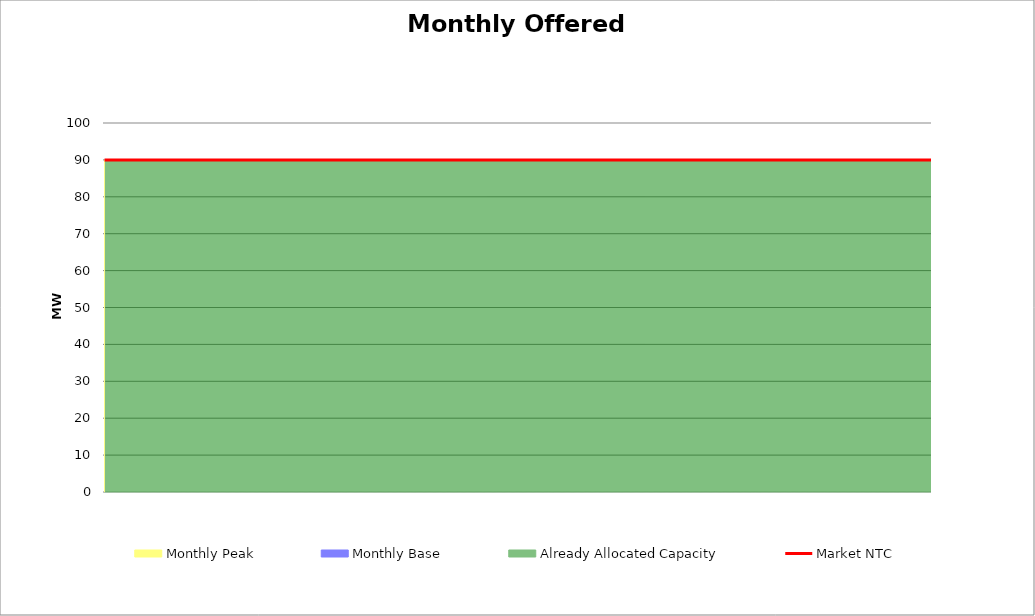
| Category | Market NTC |
|---|---|
| 0 | 90 |
| 1 | 90 |
| 2 | 90 |
| 3 | 90 |
| 4 | 90 |
| 5 | 90 |
| 6 | 90 |
| 7 | 90 |
| 8 | 90 |
| 9 | 90 |
| 10 | 90 |
| 11 | 90 |
| 12 | 90 |
| 13 | 90 |
| 14 | 90 |
| 15 | 90 |
| 16 | 90 |
| 17 | 90 |
| 18 | 90 |
| 19 | 90 |
| 20 | 90 |
| 21 | 90 |
| 22 | 90 |
| 23 | 90 |
| 24 | 90 |
| 25 | 90 |
| 26 | 90 |
| 27 | 90 |
| 28 | 90 |
| 29 | 90 |
| 30 | 90 |
| 31 | 90 |
| 32 | 90 |
| 33 | 90 |
| 34 | 90 |
| 35 | 90 |
| 36 | 90 |
| 37 | 90 |
| 38 | 90 |
| 39 | 90 |
| 40 | 90 |
| 41 | 90 |
| 42 | 90 |
| 43 | 90 |
| 44 | 90 |
| 45 | 90 |
| 46 | 90 |
| 47 | 90 |
| 48 | 90 |
| 49 | 90 |
| 50 | 90 |
| 51 | 90 |
| 52 | 90 |
| 53 | 90 |
| 54 | 90 |
| 55 | 90 |
| 56 | 90 |
| 57 | 90 |
| 58 | 90 |
| 59 | 90 |
| 60 | 90 |
| 61 | 90 |
| 62 | 90 |
| 63 | 90 |
| 64 | 90 |
| 65 | 90 |
| 66 | 90 |
| 67 | 90 |
| 68 | 90 |
| 69 | 90 |
| 70 | 90 |
| 71 | 90 |
| 72 | 90 |
| 73 | 90 |
| 74 | 90 |
| 75 | 90 |
| 76 | 90 |
| 77 | 90 |
| 78 | 90 |
| 79 | 90 |
| 80 | 90 |
| 81 | 90 |
| 82 | 90 |
| 83 | 90 |
| 84 | 90 |
| 85 | 90 |
| 86 | 90 |
| 87 | 90 |
| 88 | 90 |
| 89 | 90 |
| 90 | 90 |
| 91 | 90 |
| 92 | 90 |
| 93 | 90 |
| 94 | 90 |
| 95 | 90 |
| 96 | 90 |
| 97 | 90 |
| 98 | 90 |
| 99 | 90 |
| 100 | 90 |
| 101 | 90 |
| 102 | 90 |
| 103 | 90 |
| 104 | 90 |
| 105 | 90 |
| 106 | 90 |
| 107 | 90 |
| 108 | 90 |
| 109 | 90 |
| 110 | 90 |
| 111 | 90 |
| 112 | 90 |
| 113 | 90 |
| 114 | 90 |
| 115 | 90 |
| 116 | 90 |
| 117 | 90 |
| 118 | 90 |
| 119 | 90 |
| 120 | 90 |
| 121 | 90 |
| 122 | 90 |
| 123 | 90 |
| 124 | 90 |
| 125 | 90 |
| 126 | 90 |
| 127 | 90 |
| 128 | 90 |
| 129 | 90 |
| 130 | 90 |
| 131 | 90 |
| 132 | 90 |
| 133 | 90 |
| 134 | 90 |
| 135 | 90 |
| 136 | 90 |
| 137 | 90 |
| 138 | 90 |
| 139 | 90 |
| 140 | 90 |
| 141 | 90 |
| 142 | 90 |
| 143 | 90 |
| 144 | 90 |
| 145 | 90 |
| 146 | 90 |
| 147 | 90 |
| 148 | 90 |
| 149 | 90 |
| 150 | 90 |
| 151 | 90 |
| 152 | 90 |
| 153 | 90 |
| 154 | 90 |
| 155 | 90 |
| 156 | 90 |
| 157 | 90 |
| 158 | 90 |
| 159 | 90 |
| 160 | 90 |
| 161 | 90 |
| 162 | 90 |
| 163 | 90 |
| 164 | 90 |
| 165 | 90 |
| 166 | 90 |
| 167 | 90 |
| 168 | 90 |
| 169 | 90 |
| 170 | 90 |
| 171 | 90 |
| 172 | 90 |
| 173 | 90 |
| 174 | 90 |
| 175 | 90 |
| 176 | 90 |
| 177 | 90 |
| 178 | 90 |
| 179 | 90 |
| 180 | 90 |
| 181 | 90 |
| 182 | 90 |
| 183 | 90 |
| 184 | 90 |
| 185 | 90 |
| 186 | 90 |
| 187 | 90 |
| 188 | 90 |
| 189 | 90 |
| 190 | 90 |
| 191 | 90 |
| 192 | 90 |
| 193 | 90 |
| 194 | 90 |
| 195 | 90 |
| 196 | 90 |
| 197 | 90 |
| 198 | 90 |
| 199 | 90 |
| 200 | 90 |
| 201 | 90 |
| 202 | 90 |
| 203 | 90 |
| 204 | 90 |
| 205 | 90 |
| 206 | 90 |
| 207 | 90 |
| 208 | 90 |
| 209 | 90 |
| 210 | 90 |
| 211 | 90 |
| 212 | 90 |
| 213 | 90 |
| 214 | 90 |
| 215 | 90 |
| 216 | 90 |
| 217 | 90 |
| 218 | 90 |
| 219 | 90 |
| 220 | 90 |
| 221 | 90 |
| 222 | 90 |
| 223 | 90 |
| 224 | 90 |
| 225 | 90 |
| 226 | 90 |
| 227 | 90 |
| 228 | 90 |
| 229 | 90 |
| 230 | 90 |
| 231 | 90 |
| 232 | 90 |
| 233 | 90 |
| 234 | 90 |
| 235 | 90 |
| 236 | 90 |
| 237 | 90 |
| 238 | 90 |
| 239 | 90 |
| 240 | 90 |
| 241 | 90 |
| 242 | 90 |
| 243 | 90 |
| 244 | 90 |
| 245 | 90 |
| 246 | 90 |
| 247 | 90 |
| 248 | 90 |
| 249 | 90 |
| 250 | 90 |
| 251 | 90 |
| 252 | 90 |
| 253 | 90 |
| 254 | 90 |
| 255 | 90 |
| 256 | 90 |
| 257 | 90 |
| 258 | 90 |
| 259 | 90 |
| 260 | 90 |
| 261 | 90 |
| 262 | 90 |
| 263 | 90 |
| 264 | 90 |
| 265 | 90 |
| 266 | 90 |
| 267 | 90 |
| 268 | 90 |
| 269 | 90 |
| 270 | 90 |
| 271 | 90 |
| 272 | 90 |
| 273 | 90 |
| 274 | 90 |
| 275 | 90 |
| 276 | 90 |
| 277 | 90 |
| 278 | 90 |
| 279 | 90 |
| 280 | 90 |
| 281 | 90 |
| 282 | 90 |
| 283 | 90 |
| 284 | 90 |
| 285 | 90 |
| 286 | 90 |
| 287 | 90 |
| 288 | 90 |
| 289 | 90 |
| 290 | 90 |
| 291 | 90 |
| 292 | 90 |
| 293 | 90 |
| 294 | 90 |
| 295 | 90 |
| 296 | 90 |
| 297 | 90 |
| 298 | 90 |
| 299 | 90 |
| 300 | 90 |
| 301 | 90 |
| 302 | 90 |
| 303 | 90 |
| 304 | 90 |
| 305 | 90 |
| 306 | 90 |
| 307 | 90 |
| 308 | 90 |
| 309 | 90 |
| 310 | 90 |
| 311 | 90 |
| 312 | 90 |
| 313 | 90 |
| 314 | 90 |
| 315 | 90 |
| 316 | 90 |
| 317 | 90 |
| 318 | 90 |
| 319 | 90 |
| 320 | 90 |
| 321 | 90 |
| 322 | 90 |
| 323 | 90 |
| 324 | 90 |
| 325 | 90 |
| 326 | 90 |
| 327 | 90 |
| 328 | 90 |
| 329 | 90 |
| 330 | 90 |
| 331 | 90 |
| 332 | 90 |
| 333 | 90 |
| 334 | 90 |
| 335 | 90 |
| 336 | 90 |
| 337 | 90 |
| 338 | 90 |
| 339 | 90 |
| 340 | 90 |
| 341 | 90 |
| 342 | 90 |
| 343 | 90 |
| 344 | 90 |
| 345 | 90 |
| 346 | 90 |
| 347 | 90 |
| 348 | 90 |
| 349 | 90 |
| 350 | 90 |
| 351 | 90 |
| 352 | 90 |
| 353 | 90 |
| 354 | 90 |
| 355 | 90 |
| 356 | 90 |
| 357 | 90 |
| 358 | 90 |
| 359 | 90 |
| 360 | 90 |
| 361 | 90 |
| 362 | 90 |
| 363 | 90 |
| 364 | 90 |
| 365 | 90 |
| 366 | 90 |
| 367 | 90 |
| 368 | 90 |
| 369 | 90 |
| 370 | 90 |
| 371 | 90 |
| 372 | 90 |
| 373 | 90 |
| 374 | 90 |
| 375 | 90 |
| 376 | 90 |
| 377 | 90 |
| 378 | 90 |
| 379 | 90 |
| 380 | 90 |
| 381 | 90 |
| 382 | 90 |
| 383 | 90 |
| 384 | 90 |
| 385 | 90 |
| 386 | 90 |
| 387 | 90 |
| 388 | 90 |
| 389 | 90 |
| 390 | 90 |
| 391 | 90 |
| 392 | 90 |
| 393 | 90 |
| 394 | 90 |
| 395 | 90 |
| 396 | 90 |
| 397 | 90 |
| 398 | 90 |
| 399 | 90 |
| 400 | 90 |
| 401 | 90 |
| 402 | 90 |
| 403 | 90 |
| 404 | 90 |
| 405 | 90 |
| 406 | 90 |
| 407 | 90 |
| 408 | 90 |
| 409 | 90 |
| 410 | 90 |
| 411 | 90 |
| 412 | 90 |
| 413 | 90 |
| 414 | 90 |
| 415 | 90 |
| 416 | 90 |
| 417 | 90 |
| 418 | 90 |
| 419 | 90 |
| 420 | 90 |
| 421 | 90 |
| 422 | 90 |
| 423 | 90 |
| 424 | 90 |
| 425 | 90 |
| 426 | 90 |
| 427 | 90 |
| 428 | 90 |
| 429 | 90 |
| 430 | 90 |
| 431 | 90 |
| 432 | 90 |
| 433 | 90 |
| 434 | 90 |
| 435 | 90 |
| 436 | 90 |
| 437 | 90 |
| 438 | 90 |
| 439 | 90 |
| 440 | 90 |
| 441 | 90 |
| 442 | 90 |
| 443 | 90 |
| 444 | 90 |
| 445 | 90 |
| 446 | 90 |
| 447 | 90 |
| 448 | 90 |
| 449 | 90 |
| 450 | 90 |
| 451 | 90 |
| 452 | 90 |
| 453 | 90 |
| 454 | 90 |
| 455 | 90 |
| 456 | 90 |
| 457 | 90 |
| 458 | 90 |
| 459 | 90 |
| 460 | 90 |
| 461 | 90 |
| 462 | 90 |
| 463 | 90 |
| 464 | 90 |
| 465 | 90 |
| 466 | 90 |
| 467 | 90 |
| 468 | 90 |
| 469 | 90 |
| 470 | 90 |
| 471 | 90 |
| 472 | 90 |
| 473 | 90 |
| 474 | 90 |
| 475 | 90 |
| 476 | 90 |
| 477 | 90 |
| 478 | 90 |
| 479 | 90 |
| 480 | 90 |
| 481 | 90 |
| 482 | 90 |
| 483 | 90 |
| 484 | 90 |
| 485 | 90 |
| 486 | 90 |
| 487 | 90 |
| 488 | 90 |
| 489 | 90 |
| 490 | 90 |
| 491 | 90 |
| 492 | 90 |
| 493 | 90 |
| 494 | 90 |
| 495 | 90 |
| 496 | 90 |
| 497 | 90 |
| 498 | 90 |
| 499 | 90 |
| 500 | 90 |
| 501 | 90 |
| 502 | 90 |
| 503 | 90 |
| 504 | 90 |
| 505 | 90 |
| 506 | 90 |
| 507 | 90 |
| 508 | 90 |
| 509 | 90 |
| 510 | 90 |
| 511 | 90 |
| 512 | 90 |
| 513 | 90 |
| 514 | 90 |
| 515 | 90 |
| 516 | 90 |
| 517 | 90 |
| 518 | 90 |
| 519 | 90 |
| 520 | 90 |
| 521 | 90 |
| 522 | 90 |
| 523 | 90 |
| 524 | 90 |
| 525 | 90 |
| 526 | 90 |
| 527 | 90 |
| 528 | 90 |
| 529 | 90 |
| 530 | 90 |
| 531 | 90 |
| 532 | 90 |
| 533 | 90 |
| 534 | 90 |
| 535 | 90 |
| 536 | 90 |
| 537 | 90 |
| 538 | 90 |
| 539 | 90 |
| 540 | 90 |
| 541 | 90 |
| 542 | 90 |
| 543 | 90 |
| 544 | 90 |
| 545 | 90 |
| 546 | 90 |
| 547 | 90 |
| 548 | 90 |
| 549 | 90 |
| 550 | 90 |
| 551 | 90 |
| 552 | 90 |
| 553 | 90 |
| 554 | 90 |
| 555 | 90 |
| 556 | 90 |
| 557 | 90 |
| 558 | 90 |
| 559 | 90 |
| 560 | 90 |
| 561 | 90 |
| 562 | 90 |
| 563 | 90 |
| 564 | 90 |
| 565 | 90 |
| 566 | 90 |
| 567 | 90 |
| 568 | 90 |
| 569 | 90 |
| 570 | 90 |
| 571 | 90 |
| 572 | 90 |
| 573 | 90 |
| 574 | 90 |
| 575 | 90 |
| 576 | 90 |
| 577 | 90 |
| 578 | 90 |
| 579 | 90 |
| 580 | 90 |
| 581 | 90 |
| 582 | 90 |
| 583 | 90 |
| 584 | 90 |
| 585 | 90 |
| 586 | 90 |
| 587 | 90 |
| 588 | 90 |
| 589 | 90 |
| 590 | 90 |
| 591 | 90 |
| 592 | 90 |
| 593 | 90 |
| 594 | 90 |
| 595 | 90 |
| 596 | 90 |
| 597 | 90 |
| 598 | 90 |
| 599 | 90 |
| 600 | 90 |
| 601 | 90 |
| 602 | 90 |
| 603 | 90 |
| 604 | 90 |
| 605 | 90 |
| 606 | 90 |
| 607 | 90 |
| 608 | 90 |
| 609 | 90 |
| 610 | 90 |
| 611 | 90 |
| 612 | 90 |
| 613 | 90 |
| 614 | 90 |
| 615 | 90 |
| 616 | 90 |
| 617 | 90 |
| 618 | 90 |
| 619 | 90 |
| 620 | 90 |
| 621 | 90 |
| 622 | 90 |
| 623 | 90 |
| 624 | 90 |
| 625 | 90 |
| 626 | 90 |
| 627 | 90 |
| 628 | 90 |
| 629 | 90 |
| 630 | 90 |
| 631 | 90 |
| 632 | 90 |
| 633 | 90 |
| 634 | 90 |
| 635 | 90 |
| 636 | 90 |
| 637 | 90 |
| 638 | 90 |
| 639 | 90 |
| 640 | 90 |
| 641 | 90 |
| 642 | 90 |
| 643 | 90 |
| 644 | 90 |
| 645 | 90 |
| 646 | 90 |
| 647 | 90 |
| 648 | 90 |
| 649 | 90 |
| 650 | 90 |
| 651 | 90 |
| 652 | 90 |
| 653 | 90 |
| 654 | 90 |
| 655 | 90 |
| 656 | 90 |
| 657 | 90 |
| 658 | 90 |
| 659 | 90 |
| 660 | 90 |
| 661 | 90 |
| 662 | 90 |
| 663 | 90 |
| 664 | 90 |
| 665 | 90 |
| 666 | 90 |
| 667 | 90 |
| 668 | 90 |
| 669 | 90 |
| 670 | 90 |
| 671 | 90 |
| 672 | 90 |
| 673 | 90 |
| 674 | 90 |
| 675 | 90 |
| 676 | 90 |
| 677 | 90 |
| 678 | 90 |
| 679 | 90 |
| 680 | 90 |
| 681 | 90 |
| 682 | 90 |
| 683 | 90 |
| 684 | 90 |
| 685 | 90 |
| 686 | 90 |
| 687 | 90 |
| 688 | 90 |
| 689 | 90 |
| 690 | 90 |
| 691 | 90 |
| 692 | 90 |
| 693 | 90 |
| 694 | 90 |
| 695 | 90 |
| 696 | 90 |
| 697 | 90 |
| 698 | 90 |
| 699 | 90 |
| 700 | 90 |
| 701 | 90 |
| 702 | 90 |
| 703 | 90 |
| 704 | 90 |
| 705 | 90 |
| 706 | 90 |
| 707 | 90 |
| 708 | 90 |
| 709 | 90 |
| 710 | 90 |
| 711 | 90 |
| 712 | 90 |
| 713 | 90 |
| 714 | 90 |
| 715 | 90 |
| 716 | 90 |
| 717 | 90 |
| 718 | 90 |
| 719 | 90 |
| 720 | 90 |
| 721 | 90 |
| 722 | 90 |
| 723 | 90 |
| 724 | 90 |
| 725 | 90 |
| 726 | 90 |
| 727 | 90 |
| 728 | 90 |
| 729 | 90 |
| 730 | 90 |
| 731 | 90 |
| 732 | 90 |
| 733 | 90 |
| 734 | 90 |
| 735 | 90 |
| 736 | 90 |
| 737 | 90 |
| 738 | 90 |
| 739 | 90 |
| 740 | 90 |
| 741 | 90 |
| 742 | 90 |
| 743 | 90 |